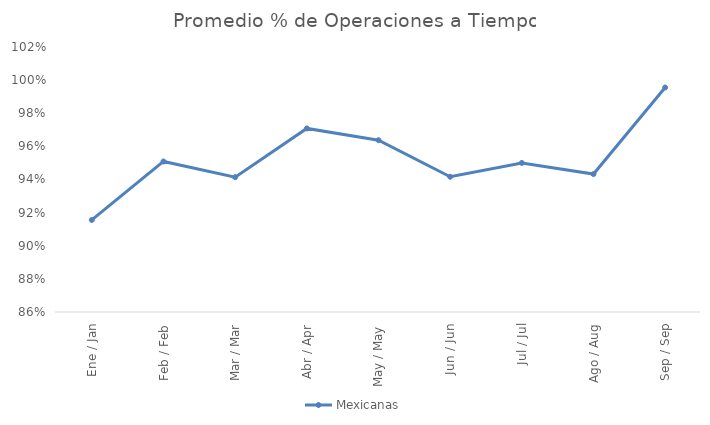
| Category | Mexicanas |
|---|---|
| Ene / Jan | 0.916 |
| Feb / Feb | 0.951 |
| Mar / Mar | 0.941 |
| Abr / Apr | 0.971 |
| May / May | 0.964 |
| Jun / Jun | 0.942 |
| Jul / Jul | 0.95 |
| Ago / Aug | 0.943 |
| Sep / Sep | 0.996 |